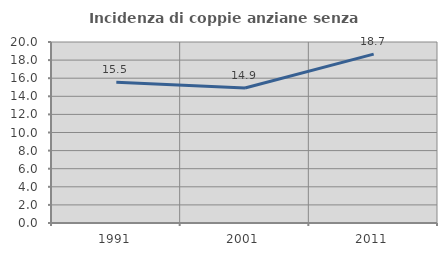
| Category | Incidenza di coppie anziane senza figli  |
|---|---|
| 1991.0 | 15.548 |
| 2001.0 | 14.919 |
| 2011.0 | 18.66 |